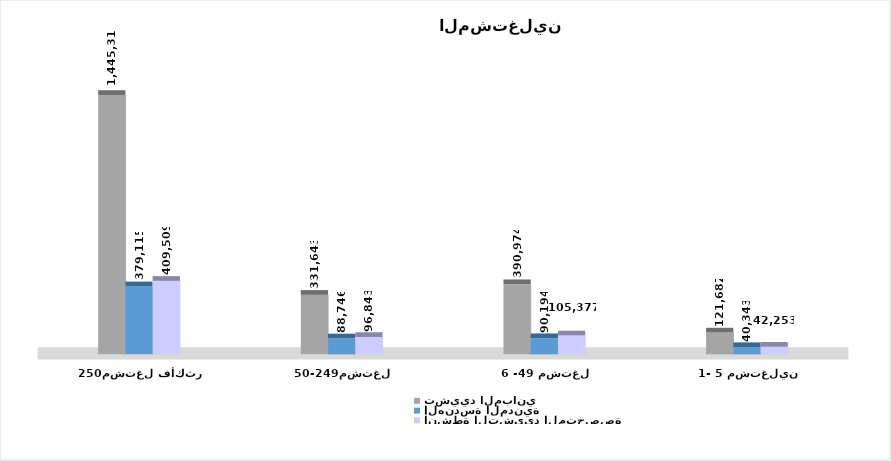
| Category | تشييد المباني | الهندسة المدنية | أنشطة التشييد المتخصصة |
|---|---|---|---|
| 1- 5 مشتغلين | 121682 | 40343 | 42253 |
| 6 -49 مشتغل | 390974 | 90194 | 105377 |
| 50-249مشتغل | 331643 | 88746 | 96843 |
| 250مشتغل فأكثر | 1445318 | 379115 | 409509 |